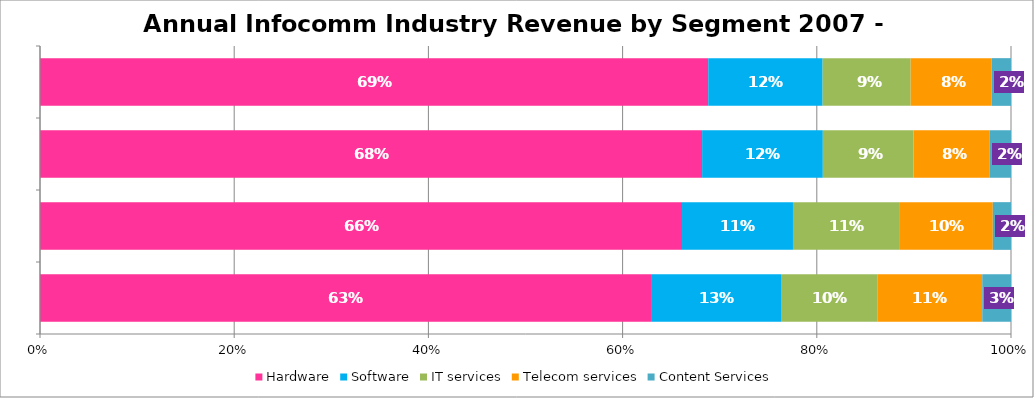
| Category | Hardware | Software | IT services | Telecom services | Content Services |
|---|---|---|---|---|---|
|  | 0.629 | 0.134 | 0.099 | 0.108 | 0.03 |
|  | 0.661 | 0.114 | 0.11 | 0.096 | 0.019 |
|  | 0.682 | 0.124 | 0.093 | 0.079 | 0.022 |
|  | 0.688 | 0.118 | 0.091 | 0.083 | 0.02 |